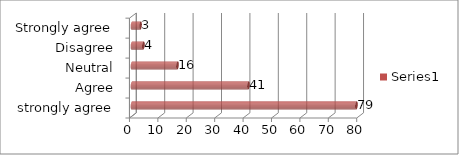
| Category | Series 0 |
|---|---|
| strongly agree | 79 |
| Agree | 41 |
| Neutral | 16 |
| Disagree | 4 |
| Strongly agree | 3 |